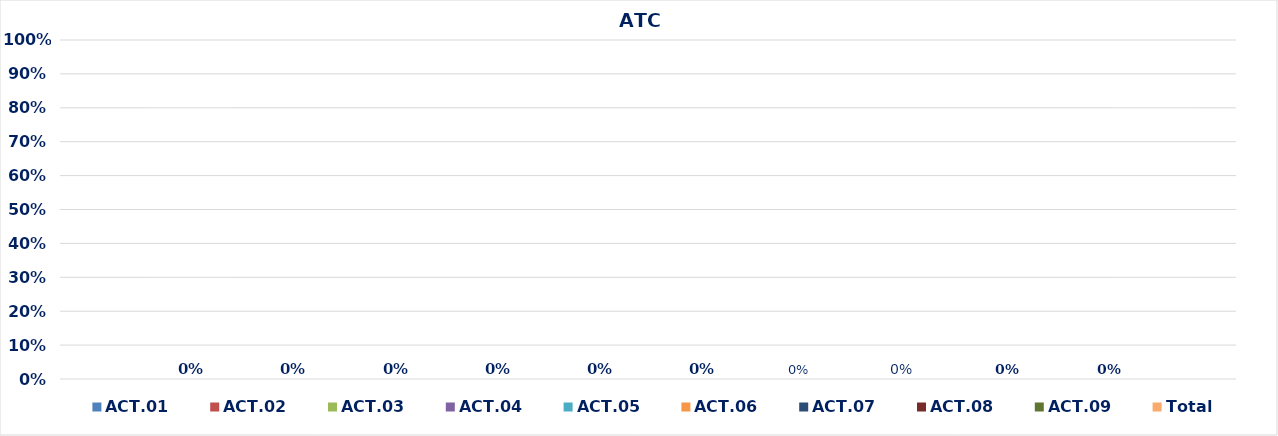
| Category | ACT.01 | ACT.02 | ACT.03 | ACT.04 | ACT.05 | ACT.06 | ACT.07 | ACT.08 | ACT.09 | Total |
|---|---|---|---|---|---|---|---|---|---|---|
| 0 | 0 | 0 | 0 | 0 | 0 | 0 | 0 | 0 | 0 | 0 |